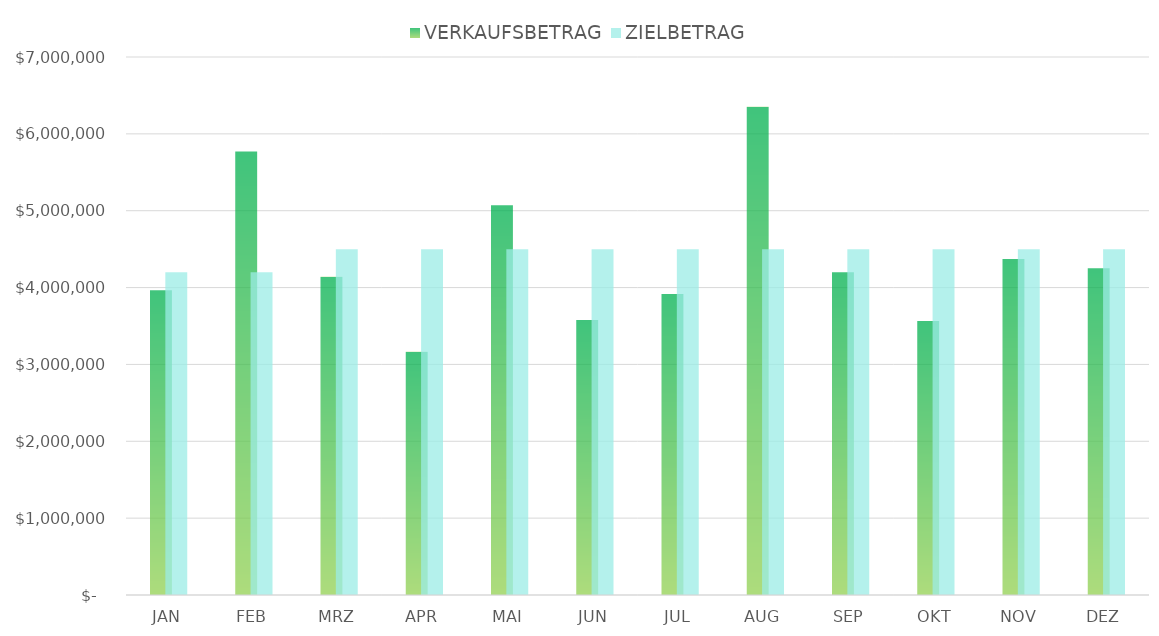
| Category | VERKAUFSBETRAG | ZIELBETRAG |
|---|---|---|
| JAN | 3964785 | 4200000 |
| FEB | 5772041 | 4200000 |
| MRZ | 4139699 | 4500000 |
| APR | 3166287 | 4500000 |
| MAI | 5072530 | 4500000 |
| JUN | 3577330 | 4500000 |
| JUL | 3916803 | 4500000 |
| AUG | 6352355 | 4500000 |
| SEP | 4198802 | 4500000 |
| OKT | 3563537 | 4500000 |
| NOV | 4373343 | 4500000 |
| DEZ | 4250199 | 4500000 |